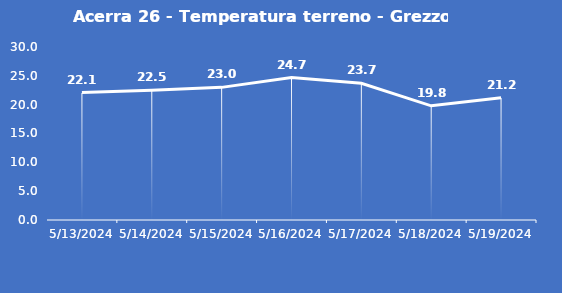
| Category | Acerra 26 - Temperatura terreno - Grezzo (°C) |
|---|---|
| 5/13/24 | 22.1 |
| 5/14/24 | 22.5 |
| 5/15/24 | 23 |
| 5/16/24 | 24.7 |
| 5/17/24 | 23.7 |
| 5/18/24 | 19.8 |
| 5/19/24 | 21.2 |